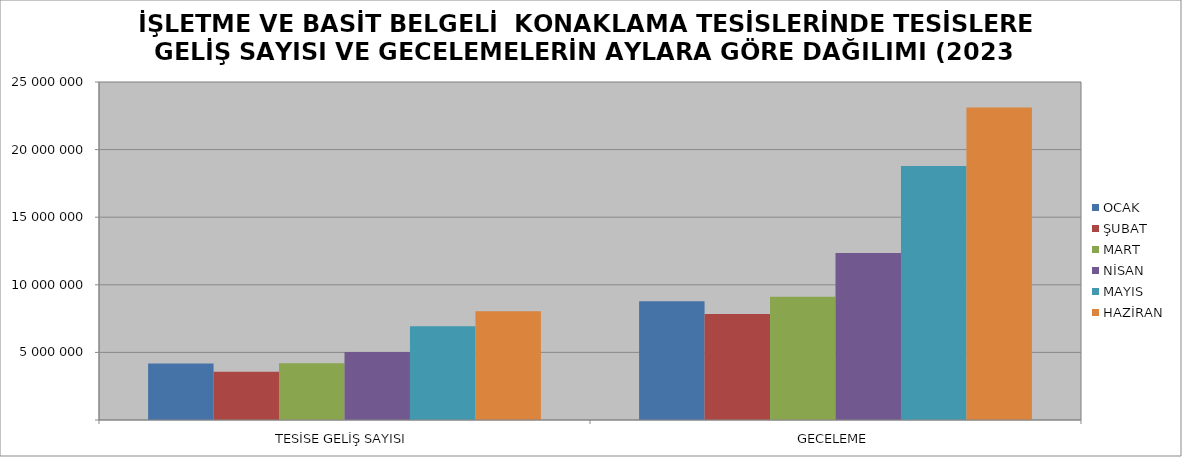
| Category | OCAK | ŞUBAT | MART | NİSAN | MAYIS | HAZİRAN |
|---|---|---|---|---|---|---|
| TESİSE GELİŞ SAYISI | 4176369 | 3577989 | 4200030 | 5022587 | 6927000 | 8050681 |
| GECELEME | 8783046 | 7837722 | 9122802 | 12360237 | 18778808 | 23106038 |